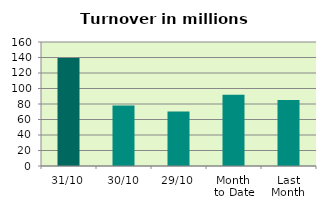
| Category | Series 0 |
|---|---|
| 31/10 | 139.413 |
| 30/10 | 78.196 |
| 29/10 | 70.211 |
| Month 
to Date | 91.964 |
| Last
Month | 85.072 |